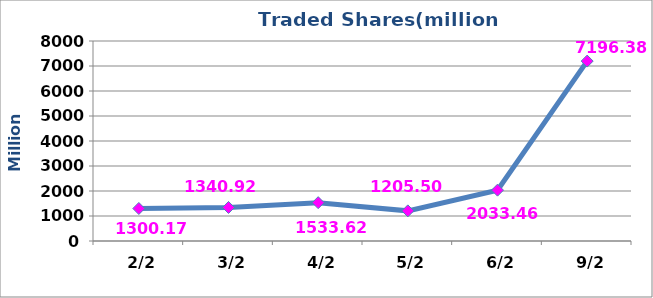
| Category | عدد الاسهم |
|---|---|
|  2/2 | 1300176559 |
|  3/2 | 1340919589 |
|  4/2 | 1533620937 |
|  5/2 | 1205505885 |
|  6/2 | 2033460124 |
|  9/2 | 7196387408 |